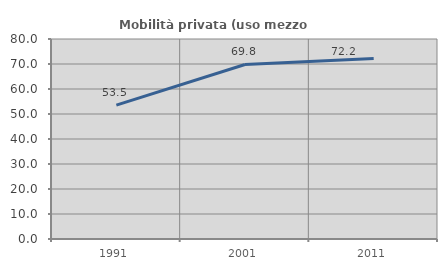
| Category | Mobilità privata (uso mezzo privato) |
|---|---|
| 1991.0 | 53.526 |
| 2001.0 | 69.822 |
| 2011.0 | 72.17 |